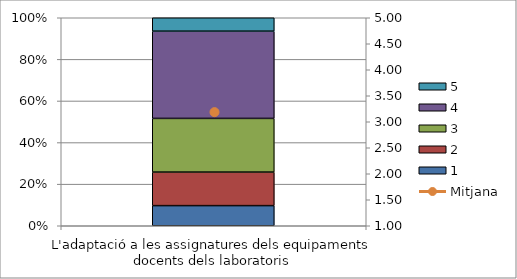
| Category | 1 | 2 | 3 | 4 | 5 |
|---|---|---|---|---|---|
| L'adaptació a les assignatures dels equipaments docents dels laboratoris | 3 | 5 | 8 | 13 | 2 |